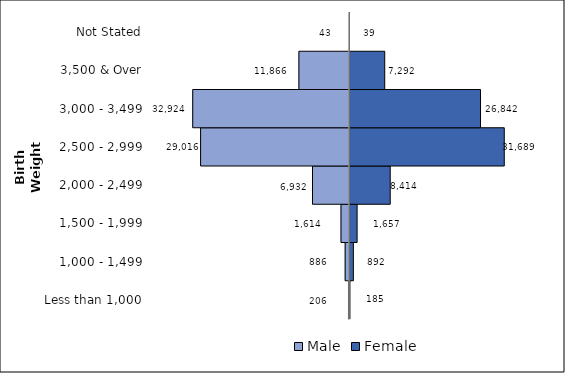
| Category | Male | Female |
|---|---|---|
| Less than 1,000 | -206 | 185 |
| 1,000 - 1,499 | -886 | 892 |
| 1,500 - 1,999 | -1734 | 1657 |
| 2,000 - 2,499 | -7549 | 8414 |
| 2,500 - 2,999 | -30386 | 31689 |
| 3,000 - 3,499 | -31993 | 26842 |
| 3,500 & Over | -10325 | 7292 |
| Not Stated | -43 | 39 |